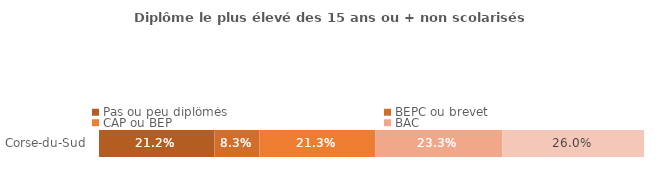
| Category | Pas ou peu diplômés | BEPC ou brevet | CAP ou BEP | BAC | Diplôme de l'enseignement supérieur |
|---|---|---|---|---|---|
| Corse-du-Sud | 0.212 | 0.083 | 0.213 | 0.233 | 0.26 |